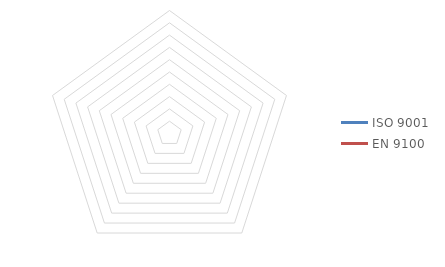
| Category | ISO 9001 | EN 9100 |
|---|---|---|
| Article 7.1  : Ressources | 0 | 0 |
| Article 7.2  : Compétences | 0 | 0 |
| Article 7.3  : Sensibilisation | 0 | 0 |
| Article 7.4  : Communication | 0 | 0 |
| Article 7.5  : Informations documentées | 0 | 0 |